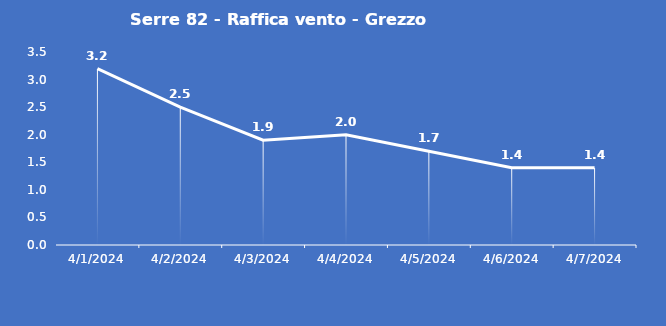
| Category | Serre 82 - Raffica vento - Grezzo (m/s) |
|---|---|
| 4/1/24 | 3.2 |
| 4/2/24 | 2.5 |
| 4/3/24 | 1.9 |
| 4/4/24 | 2 |
| 4/5/24 | 1.7 |
| 4/6/24 | 1.4 |
| 4/7/24 | 1.4 |